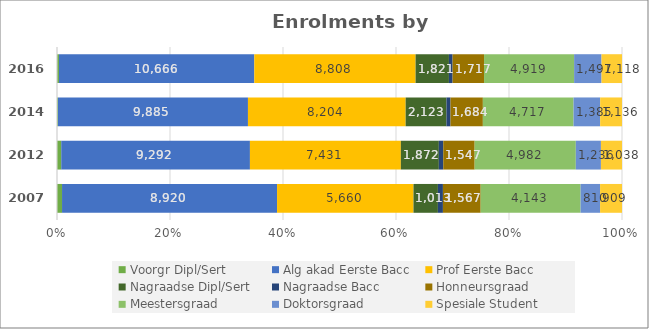
| Category | Voorgr Dipl/Sert | Alg akad Eerste Bacc | Prof Eerste Bacc | Nagraadse Dipl/Sert | Nagraadse Bacc | Honneursgraad | Meestersgraad | Doktorsgraad | Spesiale Student |
|---|---|---|---|---|---|---|---|---|---|
| 2007 | 209 | 8920 | 5660 | 1013 | 208 | 1567 | 4143 | 810 | 909 |
| 2012 | 209 | 9292 | 7431 | 1872 | 216 | 1547 | 4982 | 1236 | 1038 |
| 2014 | 49 | 9885 | 8204 | 2123 | 210 | 1684 | 4717 | 1385 | 1136 |
| 2016 | 108 | 10666 | 8808 | 1821 | 200 | 1717 | 4919 | 1497 | 1118 |